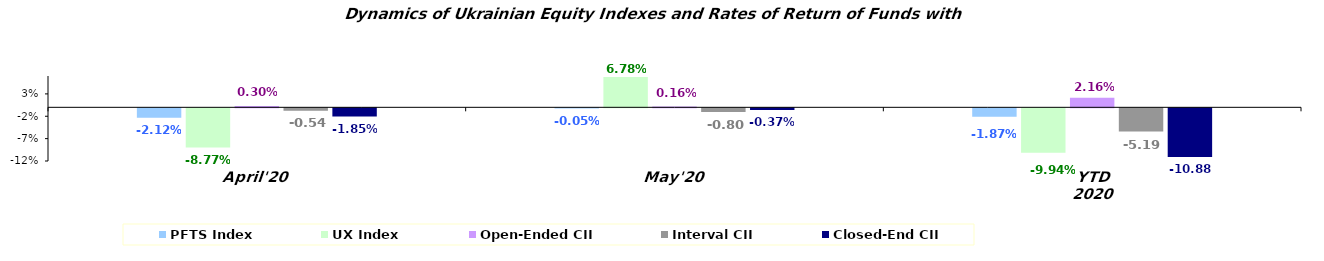
| Category | PFTS Index | UX Index | Open-Ended CII | Interval CII | Closed-End CII |
|---|---|---|---|---|---|
| April'20 | -0.021 | -0.088 | 0.003 | -0.005 | -0.018 |
| May'20 | 0 | 0.068 | 0.002 | -0.008 | -0.004 |
| YTD 2020 | -0.019 | -0.099 | 0.022 | -0.052 | -0.109 |